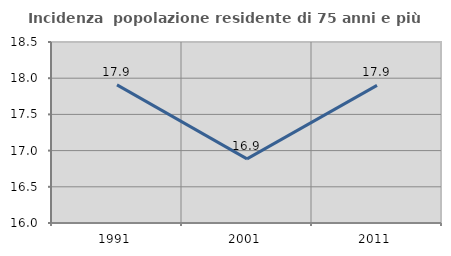
| Category | Incidenza  popolazione residente di 75 anni e più |
|---|---|
| 1991.0 | 17.908 |
| 2001.0 | 16.886 |
| 2011.0 | 17.902 |